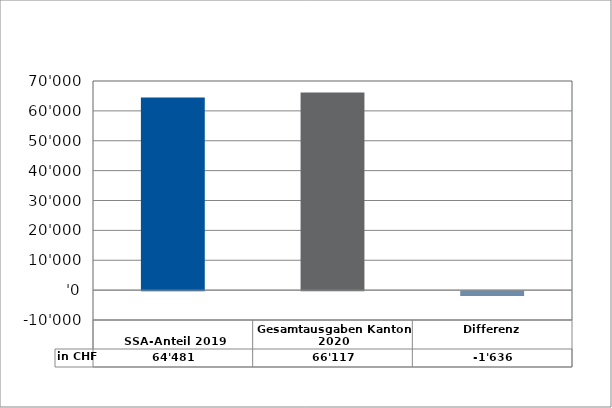
| Category | in CHF |
|---|---|
| 
SSA-Anteil 2019

 | 64481 |
| Gesamtausgaben Kanton 2020
 | 66117 |
| Differenz | -1636 |